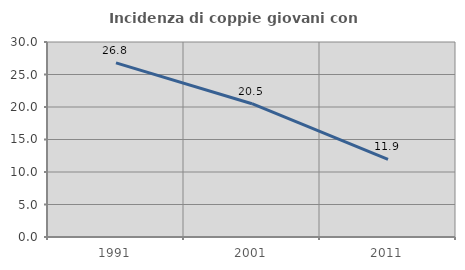
| Category | Incidenza di coppie giovani con figli |
|---|---|
| 1991.0 | 26.791 |
| 2001.0 | 20.507 |
| 2011.0 | 11.928 |